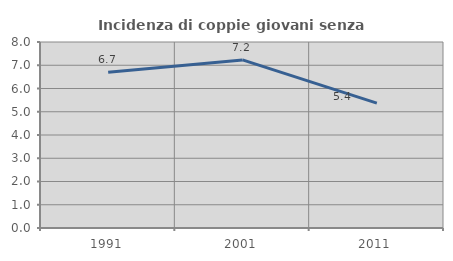
| Category | Incidenza di coppie giovani senza figli |
|---|---|
| 1991.0 | 6.702 |
| 2001.0 | 7.231 |
| 2011.0 | 5.372 |